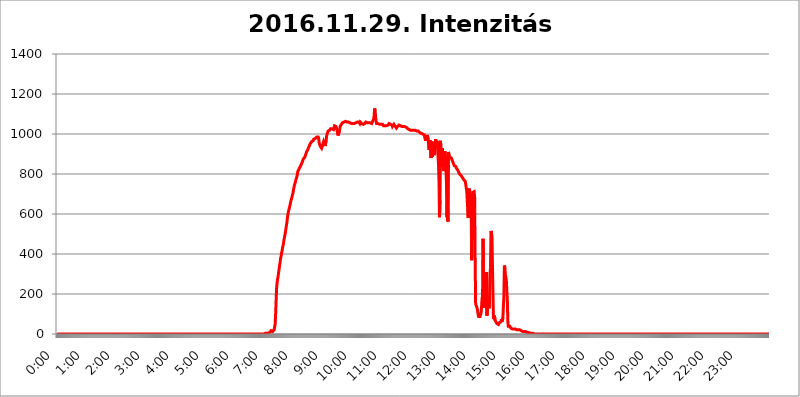
| Category | 2016.11.29. Intenzitás [W/m^2] |
|---|---|
| 0.0 | 0 |
| 0.0006944444444444445 | 0 |
| 0.001388888888888889 | 0 |
| 0.0020833333333333333 | 0 |
| 0.002777777777777778 | 0 |
| 0.003472222222222222 | 0 |
| 0.004166666666666667 | 0 |
| 0.004861111111111111 | 0 |
| 0.005555555555555556 | 0 |
| 0.0062499999999999995 | 0 |
| 0.006944444444444444 | 0 |
| 0.007638888888888889 | 0 |
| 0.008333333333333333 | 0 |
| 0.009027777777777779 | 0 |
| 0.009722222222222222 | 0 |
| 0.010416666666666666 | 0 |
| 0.011111111111111112 | 0 |
| 0.011805555555555555 | 0 |
| 0.012499999999999999 | 0 |
| 0.013194444444444444 | 0 |
| 0.013888888888888888 | 0 |
| 0.014583333333333332 | 0 |
| 0.015277777777777777 | 0 |
| 0.015972222222222224 | 0 |
| 0.016666666666666666 | 0 |
| 0.017361111111111112 | 0 |
| 0.018055555555555557 | 0 |
| 0.01875 | 0 |
| 0.019444444444444445 | 0 |
| 0.02013888888888889 | 0 |
| 0.020833333333333332 | 0 |
| 0.02152777777777778 | 0 |
| 0.022222222222222223 | 0 |
| 0.02291666666666667 | 0 |
| 0.02361111111111111 | 0 |
| 0.024305555555555556 | 0 |
| 0.024999999999999998 | 0 |
| 0.025694444444444447 | 0 |
| 0.02638888888888889 | 0 |
| 0.027083333333333334 | 0 |
| 0.027777777777777776 | 0 |
| 0.02847222222222222 | 0 |
| 0.029166666666666664 | 0 |
| 0.029861111111111113 | 0 |
| 0.030555555555555555 | 0 |
| 0.03125 | 0 |
| 0.03194444444444445 | 0 |
| 0.03263888888888889 | 0 |
| 0.03333333333333333 | 0 |
| 0.034027777777777775 | 0 |
| 0.034722222222222224 | 0 |
| 0.035416666666666666 | 0 |
| 0.036111111111111115 | 0 |
| 0.03680555555555556 | 0 |
| 0.0375 | 0 |
| 0.03819444444444444 | 0 |
| 0.03888888888888889 | 0 |
| 0.03958333333333333 | 0 |
| 0.04027777777777778 | 0 |
| 0.04097222222222222 | 0 |
| 0.041666666666666664 | 0 |
| 0.042361111111111106 | 0 |
| 0.04305555555555556 | 0 |
| 0.043750000000000004 | 0 |
| 0.044444444444444446 | 0 |
| 0.04513888888888889 | 0 |
| 0.04583333333333334 | 0 |
| 0.04652777777777778 | 0 |
| 0.04722222222222222 | 0 |
| 0.04791666666666666 | 0 |
| 0.04861111111111111 | 0 |
| 0.049305555555555554 | 0 |
| 0.049999999999999996 | 0 |
| 0.05069444444444445 | 0 |
| 0.051388888888888894 | 0 |
| 0.052083333333333336 | 0 |
| 0.05277777777777778 | 0 |
| 0.05347222222222222 | 0 |
| 0.05416666666666667 | 0 |
| 0.05486111111111111 | 0 |
| 0.05555555555555555 | 0 |
| 0.05625 | 0 |
| 0.05694444444444444 | 0 |
| 0.057638888888888885 | 0 |
| 0.05833333333333333 | 0 |
| 0.05902777777777778 | 0 |
| 0.059722222222222225 | 0 |
| 0.06041666666666667 | 0 |
| 0.061111111111111116 | 0 |
| 0.06180555555555556 | 0 |
| 0.0625 | 0 |
| 0.06319444444444444 | 0 |
| 0.06388888888888888 | 0 |
| 0.06458333333333334 | 0 |
| 0.06527777777777778 | 0 |
| 0.06597222222222222 | 0 |
| 0.06666666666666667 | 0 |
| 0.06736111111111111 | 0 |
| 0.06805555555555555 | 0 |
| 0.06874999999999999 | 0 |
| 0.06944444444444443 | 0 |
| 0.07013888888888889 | 0 |
| 0.07083333333333333 | 0 |
| 0.07152777777777779 | 0 |
| 0.07222222222222223 | 0 |
| 0.07291666666666667 | 0 |
| 0.07361111111111111 | 0 |
| 0.07430555555555556 | 0 |
| 0.075 | 0 |
| 0.07569444444444444 | 0 |
| 0.0763888888888889 | 0 |
| 0.07708333333333334 | 0 |
| 0.07777777777777778 | 0 |
| 0.07847222222222222 | 0 |
| 0.07916666666666666 | 0 |
| 0.0798611111111111 | 0 |
| 0.08055555555555556 | 0 |
| 0.08125 | 0 |
| 0.08194444444444444 | 0 |
| 0.08263888888888889 | 0 |
| 0.08333333333333333 | 0 |
| 0.08402777777777777 | 0 |
| 0.08472222222222221 | 0 |
| 0.08541666666666665 | 0 |
| 0.08611111111111112 | 0 |
| 0.08680555555555557 | 0 |
| 0.08750000000000001 | 0 |
| 0.08819444444444445 | 0 |
| 0.08888888888888889 | 0 |
| 0.08958333333333333 | 0 |
| 0.09027777777777778 | 0 |
| 0.09097222222222222 | 0 |
| 0.09166666666666667 | 0 |
| 0.09236111111111112 | 0 |
| 0.09305555555555556 | 0 |
| 0.09375 | 0 |
| 0.09444444444444444 | 0 |
| 0.09513888888888888 | 0 |
| 0.09583333333333333 | 0 |
| 0.09652777777777777 | 0 |
| 0.09722222222222222 | 0 |
| 0.09791666666666667 | 0 |
| 0.09861111111111111 | 0 |
| 0.09930555555555555 | 0 |
| 0.09999999999999999 | 0 |
| 0.10069444444444443 | 0 |
| 0.1013888888888889 | 0 |
| 0.10208333333333335 | 0 |
| 0.10277777777777779 | 0 |
| 0.10347222222222223 | 0 |
| 0.10416666666666667 | 0 |
| 0.10486111111111111 | 0 |
| 0.10555555555555556 | 0 |
| 0.10625 | 0 |
| 0.10694444444444444 | 0 |
| 0.1076388888888889 | 0 |
| 0.10833333333333334 | 0 |
| 0.10902777777777778 | 0 |
| 0.10972222222222222 | 0 |
| 0.1111111111111111 | 0 |
| 0.11180555555555556 | 0 |
| 0.11180555555555556 | 0 |
| 0.1125 | 0 |
| 0.11319444444444444 | 0 |
| 0.11388888888888889 | 0 |
| 0.11458333333333333 | 0 |
| 0.11527777777777777 | 0 |
| 0.11597222222222221 | 0 |
| 0.11666666666666665 | 0 |
| 0.1173611111111111 | 0 |
| 0.11805555555555557 | 0 |
| 0.11944444444444445 | 0 |
| 0.12013888888888889 | 0 |
| 0.12083333333333333 | 0 |
| 0.12152777777777778 | 0 |
| 0.12222222222222223 | 0 |
| 0.12291666666666667 | 0 |
| 0.12291666666666667 | 0 |
| 0.12361111111111112 | 0 |
| 0.12430555555555556 | 0 |
| 0.125 | 0 |
| 0.12569444444444444 | 0 |
| 0.12638888888888888 | 0 |
| 0.12708333333333333 | 0 |
| 0.16875 | 0 |
| 0.12847222222222224 | 0 |
| 0.12916666666666668 | 0 |
| 0.12986111111111112 | 0 |
| 0.13055555555555556 | 0 |
| 0.13125 | 0 |
| 0.13194444444444445 | 0 |
| 0.1326388888888889 | 0 |
| 0.13333333333333333 | 0 |
| 0.13402777777777777 | 0 |
| 0.13402777777777777 | 0 |
| 0.13472222222222222 | 0 |
| 0.13541666666666666 | 0 |
| 0.1361111111111111 | 0 |
| 0.13749999999999998 | 0 |
| 0.13819444444444443 | 0 |
| 0.1388888888888889 | 0 |
| 0.13958333333333334 | 0 |
| 0.14027777777777778 | 0 |
| 0.14097222222222222 | 0 |
| 0.14166666666666666 | 0 |
| 0.1423611111111111 | 0 |
| 0.14305555555555557 | 0 |
| 0.14375000000000002 | 0 |
| 0.14444444444444446 | 0 |
| 0.1451388888888889 | 0 |
| 0.1451388888888889 | 0 |
| 0.14652777777777778 | 0 |
| 0.14722222222222223 | 0 |
| 0.14791666666666667 | 0 |
| 0.1486111111111111 | 0 |
| 0.14930555555555555 | 0 |
| 0.15 | 0 |
| 0.15069444444444444 | 0 |
| 0.15138888888888888 | 0 |
| 0.15208333333333332 | 0 |
| 0.15277777777777776 | 0 |
| 0.15347222222222223 | 0 |
| 0.15416666666666667 | 0 |
| 0.15486111111111112 | 0 |
| 0.15555555555555556 | 0 |
| 0.15625 | 0 |
| 0.15694444444444444 | 0 |
| 0.15763888888888888 | 0 |
| 0.15833333333333333 | 0 |
| 0.15902777777777777 | 0 |
| 0.15972222222222224 | 0 |
| 0.16041666666666668 | 0 |
| 0.16111111111111112 | 0 |
| 0.16180555555555556 | 0 |
| 0.1625 | 0 |
| 0.16319444444444445 | 0 |
| 0.1638888888888889 | 0 |
| 0.16458333333333333 | 0 |
| 0.16527777777777777 | 0 |
| 0.16597222222222222 | 0 |
| 0.16666666666666666 | 0 |
| 0.1673611111111111 | 0 |
| 0.16805555555555554 | 0 |
| 0.16874999999999998 | 0 |
| 0.16944444444444443 | 0 |
| 0.17013888888888887 | 0 |
| 0.1708333333333333 | 0 |
| 0.17152777777777775 | 0 |
| 0.17222222222222225 | 0 |
| 0.1729166666666667 | 0 |
| 0.17361111111111113 | 0 |
| 0.17430555555555557 | 0 |
| 0.17500000000000002 | 0 |
| 0.17569444444444446 | 0 |
| 0.1763888888888889 | 0 |
| 0.17708333333333334 | 0 |
| 0.17777777777777778 | 0 |
| 0.17847222222222223 | 0 |
| 0.17916666666666667 | 0 |
| 0.1798611111111111 | 0 |
| 0.18055555555555555 | 0 |
| 0.18125 | 0 |
| 0.18194444444444444 | 0 |
| 0.1826388888888889 | 0 |
| 0.18333333333333335 | 0 |
| 0.1840277777777778 | 0 |
| 0.18472222222222223 | 0 |
| 0.18541666666666667 | 0 |
| 0.18611111111111112 | 0 |
| 0.18680555555555556 | 0 |
| 0.1875 | 0 |
| 0.18819444444444444 | 0 |
| 0.18888888888888888 | 0 |
| 0.18958333333333333 | 0 |
| 0.19027777777777777 | 0 |
| 0.1909722222222222 | 0 |
| 0.19166666666666665 | 0 |
| 0.19236111111111112 | 0 |
| 0.19305555555555554 | 0 |
| 0.19375 | 0 |
| 0.19444444444444445 | 0 |
| 0.1951388888888889 | 0 |
| 0.19583333333333333 | 0 |
| 0.19652777777777777 | 0 |
| 0.19722222222222222 | 0 |
| 0.19791666666666666 | 0 |
| 0.1986111111111111 | 0 |
| 0.19930555555555554 | 0 |
| 0.19999999999999998 | 0 |
| 0.20069444444444443 | 0 |
| 0.20138888888888887 | 0 |
| 0.2020833333333333 | 0 |
| 0.2027777777777778 | 0 |
| 0.2034722222222222 | 0 |
| 0.2041666666666667 | 0 |
| 0.20486111111111113 | 0 |
| 0.20555555555555557 | 0 |
| 0.20625000000000002 | 0 |
| 0.20694444444444446 | 0 |
| 0.2076388888888889 | 0 |
| 0.20833333333333334 | 0 |
| 0.20902777777777778 | 0 |
| 0.20972222222222223 | 0 |
| 0.21041666666666667 | 0 |
| 0.2111111111111111 | 0 |
| 0.21180555555555555 | 0 |
| 0.2125 | 0 |
| 0.21319444444444444 | 0 |
| 0.2138888888888889 | 0 |
| 0.21458333333333335 | 0 |
| 0.2152777777777778 | 0 |
| 0.21597222222222223 | 0 |
| 0.21666666666666667 | 0 |
| 0.21736111111111112 | 0 |
| 0.21805555555555556 | 0 |
| 0.21875 | 0 |
| 0.21944444444444444 | 0 |
| 0.22013888888888888 | 0 |
| 0.22083333333333333 | 0 |
| 0.22152777777777777 | 0 |
| 0.2222222222222222 | 0 |
| 0.22291666666666665 | 0 |
| 0.2236111111111111 | 0 |
| 0.22430555555555556 | 0 |
| 0.225 | 0 |
| 0.22569444444444445 | 0 |
| 0.2263888888888889 | 0 |
| 0.22708333333333333 | 0 |
| 0.22777777777777777 | 0 |
| 0.22847222222222222 | 0 |
| 0.22916666666666666 | 0 |
| 0.2298611111111111 | 0 |
| 0.23055555555555554 | 0 |
| 0.23124999999999998 | 0 |
| 0.23194444444444443 | 0 |
| 0.23263888888888887 | 0 |
| 0.2333333333333333 | 0 |
| 0.2340277777777778 | 0 |
| 0.2347222222222222 | 0 |
| 0.2354166666666667 | 0 |
| 0.23611111111111113 | 0 |
| 0.23680555555555557 | 0 |
| 0.23750000000000002 | 0 |
| 0.23819444444444446 | 0 |
| 0.2388888888888889 | 0 |
| 0.23958333333333334 | 0 |
| 0.24027777777777778 | 0 |
| 0.24097222222222223 | 0 |
| 0.24166666666666667 | 0 |
| 0.2423611111111111 | 0 |
| 0.24305555555555555 | 0 |
| 0.24375 | 0 |
| 0.24444444444444446 | 0 |
| 0.24513888888888888 | 0 |
| 0.24583333333333335 | 0 |
| 0.2465277777777778 | 0 |
| 0.24722222222222223 | 0 |
| 0.24791666666666667 | 0 |
| 0.24861111111111112 | 0 |
| 0.24930555555555556 | 0 |
| 0.25 | 0 |
| 0.25069444444444444 | 0 |
| 0.2513888888888889 | 0 |
| 0.2520833333333333 | 0 |
| 0.25277777777777777 | 0 |
| 0.2534722222222222 | 0 |
| 0.25416666666666665 | 0 |
| 0.2548611111111111 | 0 |
| 0.2555555555555556 | 0 |
| 0.25625000000000003 | 0 |
| 0.2569444444444445 | 0 |
| 0.2576388888888889 | 0 |
| 0.25833333333333336 | 0 |
| 0.2590277777777778 | 0 |
| 0.25972222222222224 | 0 |
| 0.2604166666666667 | 0 |
| 0.2611111111111111 | 0 |
| 0.26180555555555557 | 0 |
| 0.2625 | 0 |
| 0.26319444444444445 | 0 |
| 0.2638888888888889 | 0 |
| 0.26458333333333334 | 0 |
| 0.2652777777777778 | 0 |
| 0.2659722222222222 | 0 |
| 0.26666666666666666 | 0 |
| 0.2673611111111111 | 0 |
| 0.26805555555555555 | 0 |
| 0.26875 | 0 |
| 0.26944444444444443 | 0 |
| 0.2701388888888889 | 0 |
| 0.2708333333333333 | 0 |
| 0.27152777777777776 | 0 |
| 0.2722222222222222 | 0 |
| 0.27291666666666664 | 0 |
| 0.2736111111111111 | 0 |
| 0.2743055555555555 | 0 |
| 0.27499999999999997 | 0 |
| 0.27569444444444446 | 0 |
| 0.27638888888888885 | 0 |
| 0.27708333333333335 | 0 |
| 0.2777777777777778 | 0 |
| 0.27847222222222223 | 0 |
| 0.2791666666666667 | 0 |
| 0.2798611111111111 | 0 |
| 0.28055555555555556 | 0 |
| 0.28125 | 0 |
| 0.28194444444444444 | 0 |
| 0.2826388888888889 | 0 |
| 0.2833333333333333 | 0 |
| 0.28402777777777777 | 0 |
| 0.2847222222222222 | 0 |
| 0.28541666666666665 | 0 |
| 0.28611111111111115 | 0 |
| 0.28680555555555554 | 0 |
| 0.28750000000000003 | 0 |
| 0.2881944444444445 | 0 |
| 0.2888888888888889 | 0 |
| 0.28958333333333336 | 0 |
| 0.2902777777777778 | 0 |
| 0.29097222222222224 | 3.525 |
| 0.2916666666666667 | 3.525 |
| 0.2923611111111111 | 3.525 |
| 0.29305555555555557 | 3.525 |
| 0.29375 | 3.525 |
| 0.29444444444444445 | 3.525 |
| 0.2951388888888889 | 3.525 |
| 0.29583333333333334 | 3.525 |
| 0.2965277777777778 | 3.525 |
| 0.2972222222222222 | 7.887 |
| 0.29791666666666666 | 7.887 |
| 0.2986111111111111 | 12.257 |
| 0.29930555555555555 | 12.257 |
| 0.3 | 16.636 |
| 0.30069444444444443 | 16.636 |
| 0.3013888888888889 | 12.257 |
| 0.3020833333333333 | 12.257 |
| 0.30277777777777776 | 16.636 |
| 0.3034722222222222 | 16.636 |
| 0.30416666666666664 | 21.024 |
| 0.3048611111111111 | 25.419 |
| 0.3055555555555555 | 47.511 |
| 0.30624999999999997 | 96.682 |
| 0.3069444444444444 | 164.605 |
| 0.3076388888888889 | 228.436 |
| 0.30833333333333335 | 255.813 |
| 0.3090277777777778 | 274.047 |
| 0.30972222222222223 | 287.709 |
| 0.3104166666666667 | 305.898 |
| 0.3111111111111111 | 324.052 |
| 0.31180555555555556 | 342.162 |
| 0.3125 | 355.712 |
| 0.31319444444444444 | 378.224 |
| 0.3138888888888889 | 387.202 |
| 0.3145833333333333 | 405.108 |
| 0.31527777777777777 | 414.035 |
| 0.3159722222222222 | 431.833 |
| 0.31666666666666665 | 440.702 |
| 0.31736111111111115 | 453.968 |
| 0.31805555555555554 | 471.582 |
| 0.31875000000000003 | 484.735 |
| 0.3194444444444445 | 497.836 |
| 0.3201388888888889 | 510.885 |
| 0.32083333333333336 | 528.2 |
| 0.3215277777777778 | 545.416 |
| 0.32222222222222224 | 562.53 |
| 0.3229166666666667 | 583.779 |
| 0.3236111111111111 | 600.661 |
| 0.32430555555555557 | 613.252 |
| 0.325 | 621.613 |
| 0.32569444444444445 | 634.105 |
| 0.3263888888888889 | 642.4 |
| 0.32708333333333334 | 654.791 |
| 0.3277777777777778 | 667.123 |
| 0.3284722222222222 | 675.311 |
| 0.32916666666666666 | 683.473 |
| 0.3298611111111111 | 695.666 |
| 0.33055555555555555 | 703.762 |
| 0.33125 | 719.877 |
| 0.33194444444444443 | 731.896 |
| 0.3326388888888889 | 743.859 |
| 0.3333333333333333 | 751.803 |
| 0.3340277777777778 | 759.723 |
| 0.3347222222222222 | 771.559 |
| 0.3354166666666667 | 779.42 |
| 0.3361111111111111 | 787.258 |
| 0.3368055555555556 | 798.974 |
| 0.33749999999999997 | 814.519 |
| 0.33819444444444446 | 818.392 |
| 0.33888888888888885 | 822.26 |
| 0.33958333333333335 | 829.981 |
| 0.34027777777777773 | 833.834 |
| 0.34097222222222223 | 837.682 |
| 0.3416666666666666 | 841.526 |
| 0.3423611111111111 | 849.199 |
| 0.3430555555555555 | 853.029 |
| 0.34375 | 860.676 |
| 0.3444444444444445 | 868.305 |
| 0.3451388888888889 | 875.918 |
| 0.3458333333333334 | 879.719 |
| 0.34652777777777777 | 879.719 |
| 0.34722222222222227 | 883.516 |
| 0.34791666666666665 | 891.099 |
| 0.34861111111111115 | 894.885 |
| 0.34930555555555554 | 906.223 |
| 0.35000000000000003 | 913.766 |
| 0.3506944444444444 | 917.534 |
| 0.3513888888888889 | 921.298 |
| 0.3520833333333333 | 928.819 |
| 0.3527777777777778 | 932.576 |
| 0.3534722222222222 | 940.082 |
| 0.3541666666666667 | 947.58 |
| 0.3548611111111111 | 947.58 |
| 0.35555555555555557 | 955.071 |
| 0.35625 | 958.814 |
| 0.35694444444444445 | 962.555 |
| 0.3576388888888889 | 966.295 |
| 0.35833333333333334 | 966.295 |
| 0.3590277777777778 | 966.295 |
| 0.3597222222222222 | 973.772 |
| 0.36041666666666666 | 973.772 |
| 0.3611111111111111 | 977.508 |
| 0.36180555555555555 | 977.508 |
| 0.3625 | 977.508 |
| 0.36319444444444443 | 981.244 |
| 0.3638888888888889 | 984.98 |
| 0.3645833333333333 | 984.98 |
| 0.3652777777777778 | 984.98 |
| 0.3659722222222222 | 984.98 |
| 0.3666666666666667 | 977.508 |
| 0.3673611111111111 | 955.071 |
| 0.3680555555555556 | 947.58 |
| 0.36874999999999997 | 940.082 |
| 0.36944444444444446 | 936.33 |
| 0.37013888888888885 | 940.082 |
| 0.37083333333333335 | 928.819 |
| 0.37152777777777773 | 936.33 |
| 0.37222222222222223 | 940.082 |
| 0.3729166666666666 | 955.071 |
| 0.3736111111111111 | 962.555 |
| 0.3743055555555555 | 966.295 |
| 0.375 | 947.58 |
| 0.3756944444444445 | 940.082 |
| 0.3763888888888889 | 940.082 |
| 0.3770833333333334 | 966.295 |
| 0.37777777777777777 | 988.714 |
| 0.37847222222222227 | 999.916 |
| 0.37916666666666665 | 1007.383 |
| 0.37986111111111115 | 1014.852 |
| 0.38055555555555554 | 1018.587 |
| 0.38125000000000003 | 1018.587 |
| 0.3819444444444444 | 1018.587 |
| 0.3826388888888889 | 1022.323 |
| 0.3833333333333333 | 1026.06 |
| 0.3840277777777778 | 1022.323 |
| 0.3847222222222222 | 1026.06 |
| 0.3854166666666667 | 1026.06 |
| 0.3861111111111111 | 1029.798 |
| 0.38680555555555557 | 1026.06 |
| 0.3875 | 1022.323 |
| 0.38819444444444445 | 1029.798 |
| 0.3888888888888889 | 1041.019 |
| 0.38958333333333334 | 1041.019 |
| 0.3902777777777778 | 1041.019 |
| 0.3909722222222222 | 1037.277 |
| 0.39166666666666666 | 1029.798 |
| 0.3923611111111111 | 1026.06 |
| 0.39305555555555555 | 1007.383 |
| 0.39375 | 992.448 |
| 0.39444444444444443 | 988.714 |
| 0.3951388888888889 | 996.182 |
| 0.3958333333333333 | 1014.852 |
| 0.3965277777777778 | 1033.537 |
| 0.3972222222222222 | 1041.019 |
| 0.3979166666666667 | 1044.762 |
| 0.3986111111111111 | 1048.508 |
| 0.3993055555555556 | 1052.255 |
| 0.39999999999999997 | 1056.004 |
| 0.40069444444444446 | 1056.004 |
| 0.40138888888888885 | 1059.756 |
| 0.40208333333333335 | 1059.756 |
| 0.40277777777777773 | 1059.756 |
| 0.40347222222222223 | 1059.756 |
| 0.4041666666666666 | 1063.51 |
| 0.4048611111111111 | 1063.51 |
| 0.4055555555555555 | 1063.51 |
| 0.40625 | 1059.756 |
| 0.4069444444444445 | 1059.756 |
| 0.4076388888888889 | 1063.51 |
| 0.4083333333333334 | 1059.756 |
| 0.40902777777777777 | 1059.756 |
| 0.40972222222222227 | 1056.004 |
| 0.41041666666666665 | 1056.004 |
| 0.41111111111111115 | 1052.255 |
| 0.41180555555555554 | 1052.255 |
| 0.41250000000000003 | 1052.255 |
| 0.4131944444444444 | 1052.255 |
| 0.4138888888888889 | 1052.255 |
| 0.4145833333333333 | 1052.255 |
| 0.4152777777777778 | 1052.255 |
| 0.4159722222222222 | 1052.255 |
| 0.4166666666666667 | 1052.255 |
| 0.4173611111111111 | 1052.255 |
| 0.41805555555555557 | 1052.255 |
| 0.41875 | 1056.004 |
| 0.41944444444444445 | 1056.004 |
| 0.4201388888888889 | 1056.004 |
| 0.42083333333333334 | 1059.756 |
| 0.4215277777777778 | 1056.004 |
| 0.4222222222222222 | 1056.004 |
| 0.42291666666666666 | 1059.756 |
| 0.4236111111111111 | 1056.004 |
| 0.42430555555555555 | 1052.255 |
| 0.425 | 1059.756 |
| 0.42569444444444443 | 1056.004 |
| 0.4263888888888889 | 1056.004 |
| 0.4270833333333333 | 1052.255 |
| 0.4277777777777778 | 1052.255 |
| 0.4284722222222222 | 1052.255 |
| 0.4291666666666667 | 1048.508 |
| 0.4298611111111111 | 1052.255 |
| 0.4305555555555556 | 1052.255 |
| 0.43124999999999997 | 1052.255 |
| 0.43194444444444446 | 1052.255 |
| 0.43263888888888885 | 1059.756 |
| 0.43333333333333335 | 1059.756 |
| 0.43402777777777773 | 1059.756 |
| 0.43472222222222223 | 1056.004 |
| 0.4354166666666666 | 1056.004 |
| 0.4361111111111111 | 1056.004 |
| 0.4368055555555555 | 1056.004 |
| 0.4375 | 1056.004 |
| 0.4381944444444445 | 1052.255 |
| 0.4388888888888889 | 1056.004 |
| 0.4395833333333334 | 1056.004 |
| 0.44027777777777777 | 1052.255 |
| 0.44097222222222227 | 1052.255 |
| 0.44166666666666665 | 1056.004 |
| 0.44236111111111115 | 1063.51 |
| 0.44305555555555554 | 1067.267 |
| 0.44375000000000003 | 1074.789 |
| 0.4444444444444444 | 1089.873 |
| 0.4451388888888889 | 1127.879 |
| 0.4458333333333333 | 1116.426 |
| 0.4465277777777778 | 1082.324 |
| 0.4472222222222222 | 1063.51 |
| 0.4479166666666667 | 1052.255 |
| 0.4486111111111111 | 1048.508 |
| 0.44930555555555557 | 1052.255 |
| 0.45 | 1052.255 |
| 0.45069444444444445 | 1052.255 |
| 0.4513888888888889 | 1048.508 |
| 0.45208333333333334 | 1048.508 |
| 0.4527777777777778 | 1048.508 |
| 0.4534722222222222 | 1048.508 |
| 0.45416666666666666 | 1048.508 |
| 0.4548611111111111 | 1048.508 |
| 0.45555555555555555 | 1044.762 |
| 0.45625 | 1048.508 |
| 0.45694444444444443 | 1044.762 |
| 0.4576388888888889 | 1041.019 |
| 0.4583333333333333 | 1041.019 |
| 0.4590277777777778 | 1041.019 |
| 0.4597222222222222 | 1041.019 |
| 0.4604166666666667 | 1044.762 |
| 0.4611111111111111 | 1044.762 |
| 0.4618055555555556 | 1041.019 |
| 0.46249999999999997 | 1041.019 |
| 0.46319444444444446 | 1041.019 |
| 0.46388888888888885 | 1044.762 |
| 0.46458333333333335 | 1048.508 |
| 0.46527777777777773 | 1052.255 |
| 0.46597222222222223 | 1052.255 |
| 0.4666666666666666 | 1052.255 |
| 0.4673611111111111 | 1048.508 |
| 0.4680555555555555 | 1044.762 |
| 0.46875 | 1044.762 |
| 0.4694444444444445 | 1044.762 |
| 0.4701388888888889 | 1037.277 |
| 0.4708333333333334 | 1037.277 |
| 0.47152777777777777 | 1041.019 |
| 0.47222222222222227 | 1048.508 |
| 0.47291666666666665 | 1044.762 |
| 0.47361111111111115 | 1041.019 |
| 0.47430555555555554 | 1041.019 |
| 0.47500000000000003 | 1037.277 |
| 0.4756944444444444 | 1029.798 |
| 0.4763888888888889 | 1029.798 |
| 0.4770833333333333 | 1037.277 |
| 0.4777777777777778 | 1041.019 |
| 0.4784722222222222 | 1041.019 |
| 0.4791666666666667 | 1044.762 |
| 0.4798611111111111 | 1041.019 |
| 0.48055555555555557 | 1041.019 |
| 0.48125 | 1041.019 |
| 0.48194444444444445 | 1041.019 |
| 0.4826388888888889 | 1041.019 |
| 0.48333333333333334 | 1037.277 |
| 0.4840277777777778 | 1037.277 |
| 0.4847222222222222 | 1037.277 |
| 0.48541666666666666 | 1037.277 |
| 0.4861111111111111 | 1037.277 |
| 0.48680555555555555 | 1037.277 |
| 0.4875 | 1037.277 |
| 0.48819444444444443 | 1033.537 |
| 0.4888888888888889 | 1037.277 |
| 0.4895833333333333 | 1033.537 |
| 0.4902777777777778 | 1029.798 |
| 0.4909722222222222 | 1029.798 |
| 0.4916666666666667 | 1026.06 |
| 0.4923611111111111 | 1022.323 |
| 0.4930555555555556 | 1022.323 |
| 0.49374999999999997 | 1022.323 |
| 0.49444444444444446 | 1022.323 |
| 0.49513888888888885 | 1018.587 |
| 0.49583333333333335 | 1018.587 |
| 0.49652777777777773 | 1018.587 |
| 0.49722222222222223 | 1018.587 |
| 0.4979166666666666 | 1018.587 |
| 0.4986111111111111 | 1018.587 |
| 0.4993055555555555 | 1014.852 |
| 0.5 | 1018.587 |
| 0.5006944444444444 | 1018.587 |
| 0.5013888888888889 | 1018.587 |
| 0.5020833333333333 | 1018.587 |
| 0.5027777777777778 | 1014.852 |
| 0.5034722222222222 | 1014.852 |
| 0.5041666666666667 | 1014.852 |
| 0.5048611111111111 | 1014.852 |
| 0.5055555555555555 | 1014.852 |
| 0.50625 | 1014.852 |
| 0.5069444444444444 | 1011.118 |
| 0.5076388888888889 | 1011.118 |
| 0.5083333333333333 | 1007.383 |
| 0.5090277777777777 | 1007.383 |
| 0.5097222222222222 | 1003.65 |
| 0.5104166666666666 | 1003.65 |
| 0.5111111111111112 | 999.916 |
| 0.5118055555555555 | 999.916 |
| 0.5125000000000001 | 999.916 |
| 0.5131944444444444 | 999.916 |
| 0.513888888888889 | 999.916 |
| 0.5145833333333333 | 996.182 |
| 0.5152777777777778 | 996.182 |
| 0.5159722222222222 | 992.448 |
| 0.5166666666666667 | 966.295 |
| 0.517361111111111 | 988.714 |
| 0.5180555555555556 | 992.448 |
| 0.5187499999999999 | 992.448 |
| 0.5194444444444445 | 988.714 |
| 0.5201388888888888 | 981.244 |
| 0.5208333333333334 | 947.58 |
| 0.5215277777777778 | 921.298 |
| 0.5222222222222223 | 962.555 |
| 0.5229166666666667 | 970.034 |
| 0.5236111111111111 | 970.034 |
| 0.5243055555555556 | 879.719 |
| 0.525 | 917.534 |
| 0.5256944444444445 | 962.555 |
| 0.5263888888888889 | 887.309 |
| 0.5270833333333333 | 943.832 |
| 0.5277777777777778 | 932.576 |
| 0.5284722222222222 | 894.885 |
| 0.5291666666666667 | 902.447 |
| 0.5298611111111111 | 940.082 |
| 0.5305555555555556 | 973.772 |
| 0.53125 | 970.034 |
| 0.5319444444444444 | 947.58 |
| 0.5326388888888889 | 966.295 |
| 0.5333333333333333 | 936.33 |
| 0.5340277777777778 | 940.082 |
| 0.5347222222222222 | 849.199 |
| 0.5354166666666667 | 763.674 |
| 0.5361111111111111 | 583.779 |
| 0.5368055555555555 | 667.123 |
| 0.5375 | 966.295 |
| 0.5381944444444444 | 921.298 |
| 0.5388888888888889 | 837.682 |
| 0.5395833333333333 | 906.223 |
| 0.5402777777777777 | 928.819 |
| 0.5409722222222222 | 837.682 |
| 0.5416666666666666 | 814.519 |
| 0.5423611111111112 | 849.199 |
| 0.5430555555555555 | 906.223 |
| 0.5437500000000001 | 913.766 |
| 0.5444444444444444 | 883.516 |
| 0.545138888888889 | 841.526 |
| 0.5458333333333333 | 755.766 |
| 0.5465277777777778 | 583.779 |
| 0.5472222222222222 | 658.909 |
| 0.5479166666666667 | 562.53 |
| 0.548611111111111 | 909.996 |
| 0.5493055555555556 | 902.447 |
| 0.5499999999999999 | 891.099 |
| 0.5506944444444445 | 883.516 |
| 0.5513888888888888 | 887.309 |
| 0.5520833333333334 | 883.516 |
| 0.5527777777777778 | 879.719 |
| 0.5534722222222223 | 872.114 |
| 0.5541666666666667 | 868.305 |
| 0.5548611111111111 | 860.676 |
| 0.5555555555555556 | 853.029 |
| 0.55625 | 849.199 |
| 0.5569444444444445 | 841.526 |
| 0.5576388888888889 | 845.365 |
| 0.5583333333333333 | 841.526 |
| 0.5590277777777778 | 837.682 |
| 0.5597222222222222 | 829.981 |
| 0.5604166666666667 | 826.123 |
| 0.5611111111111111 | 822.26 |
| 0.5618055555555556 | 818.392 |
| 0.5625 | 814.519 |
| 0.5631944444444444 | 806.757 |
| 0.5638888888888889 | 802.868 |
| 0.5645833333333333 | 798.974 |
| 0.5652777777777778 | 795.074 |
| 0.5659722222222222 | 795.074 |
| 0.5666666666666667 | 791.169 |
| 0.5673611111111111 | 791.169 |
| 0.5680555555555555 | 783.342 |
| 0.56875 | 783.342 |
| 0.5694444444444444 | 779.42 |
| 0.5701388888888889 | 771.559 |
| 0.5708333333333333 | 771.559 |
| 0.5715277777777777 | 767.62 |
| 0.5722222222222222 | 763.674 |
| 0.5729166666666666 | 767.62 |
| 0.5736111111111112 | 767.62 |
| 0.5743055555555555 | 715.858 |
| 0.5750000000000001 | 671.22 |
| 0.5756944444444444 | 667.123 |
| 0.576388888888889 | 579.542 |
| 0.5770833333333333 | 727.896 |
| 0.5777777777777778 | 723.889 |
| 0.5784722222222222 | 715.858 |
| 0.5791666666666667 | 707.8 |
| 0.579861111111111 | 707.8 |
| 0.5805555555555556 | 634.105 |
| 0.5812499999999999 | 369.23 |
| 0.5819444444444445 | 621.613 |
| 0.5826388888888888 | 707.8 |
| 0.5833333333333334 | 707.8 |
| 0.5840277777777778 | 707.8 |
| 0.5847222222222223 | 711.832 |
| 0.5854166666666667 | 683.473 |
| 0.5861111111111111 | 369.23 |
| 0.5868055555555556 | 150.964 |
| 0.5875 | 150.964 |
| 0.5881944444444445 | 146.423 |
| 0.5888888888888889 | 128.284 |
| 0.5895833333333333 | 114.716 |
| 0.5902777777777778 | 96.682 |
| 0.5909722222222222 | 87.692 |
| 0.5916666666666667 | 83.205 |
| 0.5923611111111111 | 83.205 |
| 0.5930555555555556 | 87.692 |
| 0.59375 | 87.692 |
| 0.5944444444444444 | 105.69 |
| 0.5951388888888889 | 137.347 |
| 0.5958333333333333 | 178.264 |
| 0.5965277777777778 | 191.937 |
| 0.5972222222222222 | 475.972 |
| 0.5979166666666667 | 187.378 |
| 0.5986111111111111 | 150.964 |
| 0.5993055555555555 | 132.814 |
| 0.6 | 187.378 |
| 0.6006944444444444 | 169.156 |
| 0.6013888888888889 | 219.309 |
| 0.6020833333333333 | 310.44 |
| 0.6027777777777777 | 92.184 |
| 0.6034722222222222 | 187.378 |
| 0.6041666666666666 | 182.82 |
| 0.6048611111111112 | 173.709 |
| 0.6055555555555555 | 128.284 |
| 0.6062500000000001 | 164.605 |
| 0.6069444444444444 | 296.808 |
| 0.607638888888889 | 333.113 |
| 0.6083333333333333 | 515.223 |
| 0.6090277777777778 | 506.542 |
| 0.6097222222222222 | 489.108 |
| 0.6104166666666667 | 342.162 |
| 0.611111111111111 | 205.62 |
| 0.6118055555555556 | 74.246 |
| 0.6124999999999999 | 74.246 |
| 0.6131944444444445 | 92.184 |
| 0.6138888888888888 | 69.775 |
| 0.6145833333333334 | 65.31 |
| 0.6152777777777778 | 60.85 |
| 0.6159722222222223 | 56.398 |
| 0.6166666666666667 | 51.951 |
| 0.6173611111111111 | 47.511 |
| 0.6180555555555556 | 47.511 |
| 0.61875 | 47.511 |
| 0.6194444444444445 | 51.951 |
| 0.6201388888888889 | 56.398 |
| 0.6208333333333333 | 56.398 |
| 0.6215277777777778 | 60.85 |
| 0.6222222222222222 | 60.85 |
| 0.6229166666666667 | 74.246 |
| 0.6236111111111111 | 60.85 |
| 0.6243055555555556 | 65.31 |
| 0.625 | 78.722 |
| 0.6256944444444444 | 137.347 |
| 0.6263888888888889 | 182.82 |
| 0.6270833333333333 | 342.162 |
| 0.6277777777777778 | 333.113 |
| 0.6284722222222222 | 296.808 |
| 0.6291666666666667 | 283.156 |
| 0.6298611111111111 | 269.49 |
| 0.6305555555555555 | 214.746 |
| 0.63125 | 173.709 |
| 0.6319444444444444 | 65.31 |
| 0.6326388888888889 | 38.653 |
| 0.6333333333333333 | 38.653 |
| 0.6340277777777777 | 38.653 |
| 0.6347222222222222 | 38.653 |
| 0.6354166666666666 | 34.234 |
| 0.6361111111111112 | 29.823 |
| 0.6368055555555555 | 29.823 |
| 0.6375000000000001 | 29.823 |
| 0.6381944444444444 | 25.419 |
| 0.638888888888889 | 25.419 |
| 0.6395833333333333 | 25.419 |
| 0.6402777777777778 | 25.419 |
| 0.6409722222222222 | 25.419 |
| 0.6416666666666667 | 25.419 |
| 0.642361111111111 | 25.419 |
| 0.6430555555555556 | 25.419 |
| 0.6437499999999999 | 25.419 |
| 0.6444444444444445 | 21.024 |
| 0.6451388888888888 | 21.024 |
| 0.6458333333333334 | 21.024 |
| 0.6465277777777778 | 21.024 |
| 0.6472222222222223 | 21.024 |
| 0.6479166666666667 | 16.636 |
| 0.6486111111111111 | 21.024 |
| 0.6493055555555556 | 21.024 |
| 0.65 | 16.636 |
| 0.6506944444444445 | 16.636 |
| 0.6513888888888889 | 16.636 |
| 0.6520833333333333 | 12.257 |
| 0.6527777777777778 | 12.257 |
| 0.6534722222222222 | 12.257 |
| 0.6541666666666667 | 12.257 |
| 0.6548611111111111 | 12.257 |
| 0.6555555555555556 | 12.257 |
| 0.65625 | 12.257 |
| 0.6569444444444444 | 12.257 |
| 0.6576388888888889 | 7.887 |
| 0.6583333333333333 | 7.887 |
| 0.6590277777777778 | 7.887 |
| 0.6597222222222222 | 7.887 |
| 0.6604166666666667 | 7.887 |
| 0.6611111111111111 | 7.887 |
| 0.6618055555555555 | 7.887 |
| 0.6625 | 3.525 |
| 0.6631944444444444 | 3.525 |
| 0.6638888888888889 | 3.525 |
| 0.6645833333333333 | 3.525 |
| 0.6652777777777777 | 3.525 |
| 0.6659722222222222 | 3.525 |
| 0.6666666666666666 | 3.525 |
| 0.6673611111111111 | 3.525 |
| 0.6680555555555556 | 3.525 |
| 0.6687500000000001 | 0 |
| 0.6694444444444444 | 0 |
| 0.6701388888888888 | 0 |
| 0.6708333333333334 | 0 |
| 0.6715277777777778 | 0 |
| 0.6722222222222222 | 0 |
| 0.6729166666666666 | 0 |
| 0.6736111111111112 | 0 |
| 0.6743055555555556 | 0 |
| 0.6749999999999999 | 0 |
| 0.6756944444444444 | 0 |
| 0.6763888888888889 | 0 |
| 0.6770833333333334 | 0 |
| 0.6777777777777777 | 0 |
| 0.6784722222222223 | 0 |
| 0.6791666666666667 | 0 |
| 0.6798611111111111 | 0 |
| 0.6805555555555555 | 0 |
| 0.68125 | 0 |
| 0.6819444444444445 | 0 |
| 0.6826388888888889 | 0 |
| 0.6833333333333332 | 0 |
| 0.6840277777777778 | 0 |
| 0.6847222222222222 | 0 |
| 0.6854166666666667 | 0 |
| 0.686111111111111 | 0 |
| 0.6868055555555556 | 0 |
| 0.6875 | 0 |
| 0.6881944444444444 | 0 |
| 0.688888888888889 | 0 |
| 0.6895833333333333 | 0 |
| 0.6902777777777778 | 0 |
| 0.6909722222222222 | 0 |
| 0.6916666666666668 | 0 |
| 0.6923611111111111 | 0 |
| 0.6930555555555555 | 0 |
| 0.69375 | 0 |
| 0.6944444444444445 | 0 |
| 0.6951388888888889 | 0 |
| 0.6958333333333333 | 0 |
| 0.6965277777777777 | 0 |
| 0.6972222222222223 | 0 |
| 0.6979166666666666 | 0 |
| 0.6986111111111111 | 0 |
| 0.6993055555555556 | 0 |
| 0.7000000000000001 | 0 |
| 0.7006944444444444 | 0 |
| 0.7013888888888888 | 0 |
| 0.7020833333333334 | 0 |
| 0.7027777777777778 | 0 |
| 0.7034722222222222 | 0 |
| 0.7041666666666666 | 0 |
| 0.7048611111111112 | 0 |
| 0.7055555555555556 | 0 |
| 0.7062499999999999 | 0 |
| 0.7069444444444444 | 0 |
| 0.7076388888888889 | 0 |
| 0.7083333333333334 | 0 |
| 0.7090277777777777 | 0 |
| 0.7097222222222223 | 0 |
| 0.7104166666666667 | 0 |
| 0.7111111111111111 | 0 |
| 0.7118055555555555 | 0 |
| 0.7125 | 0 |
| 0.7131944444444445 | 0 |
| 0.7138888888888889 | 0 |
| 0.7145833333333332 | 0 |
| 0.7152777777777778 | 0 |
| 0.7159722222222222 | 0 |
| 0.7166666666666667 | 0 |
| 0.717361111111111 | 0 |
| 0.7180555555555556 | 0 |
| 0.71875 | 0 |
| 0.7194444444444444 | 0 |
| 0.720138888888889 | 0 |
| 0.7208333333333333 | 0 |
| 0.7215277777777778 | 0 |
| 0.7222222222222222 | 0 |
| 0.7229166666666668 | 0 |
| 0.7236111111111111 | 0 |
| 0.7243055555555555 | 0 |
| 0.725 | 0 |
| 0.7256944444444445 | 0 |
| 0.7263888888888889 | 0 |
| 0.7270833333333333 | 0 |
| 0.7277777777777777 | 0 |
| 0.7284722222222223 | 0 |
| 0.7291666666666666 | 0 |
| 0.7298611111111111 | 0 |
| 0.7305555555555556 | 0 |
| 0.7312500000000001 | 0 |
| 0.7319444444444444 | 0 |
| 0.7326388888888888 | 0 |
| 0.7333333333333334 | 0 |
| 0.7340277777777778 | 0 |
| 0.7347222222222222 | 0 |
| 0.7354166666666666 | 0 |
| 0.7361111111111112 | 0 |
| 0.7368055555555556 | 0 |
| 0.7374999999999999 | 0 |
| 0.7381944444444444 | 0 |
| 0.7388888888888889 | 0 |
| 0.7395833333333334 | 0 |
| 0.7402777777777777 | 0 |
| 0.7409722222222223 | 0 |
| 0.7416666666666667 | 0 |
| 0.7423611111111111 | 0 |
| 0.7430555555555555 | 0 |
| 0.74375 | 0 |
| 0.7444444444444445 | 0 |
| 0.7451388888888889 | 0 |
| 0.7458333333333332 | 0 |
| 0.7465277777777778 | 0 |
| 0.7472222222222222 | 0 |
| 0.7479166666666667 | 0 |
| 0.748611111111111 | 0 |
| 0.7493055555555556 | 0 |
| 0.75 | 0 |
| 0.7506944444444444 | 0 |
| 0.751388888888889 | 0 |
| 0.7520833333333333 | 0 |
| 0.7527777777777778 | 0 |
| 0.7534722222222222 | 0 |
| 0.7541666666666668 | 0 |
| 0.7548611111111111 | 0 |
| 0.7555555555555555 | 0 |
| 0.75625 | 0 |
| 0.7569444444444445 | 0 |
| 0.7576388888888889 | 0 |
| 0.7583333333333333 | 0 |
| 0.7590277777777777 | 0 |
| 0.7597222222222223 | 0 |
| 0.7604166666666666 | 0 |
| 0.7611111111111111 | 0 |
| 0.7618055555555556 | 0 |
| 0.7625000000000001 | 0 |
| 0.7631944444444444 | 0 |
| 0.7638888888888888 | 0 |
| 0.7645833333333334 | 0 |
| 0.7652777777777778 | 0 |
| 0.7659722222222222 | 0 |
| 0.7666666666666666 | 0 |
| 0.7673611111111112 | 0 |
| 0.7680555555555556 | 0 |
| 0.7687499999999999 | 0 |
| 0.7694444444444444 | 0 |
| 0.7701388888888889 | 0 |
| 0.7708333333333334 | 0 |
| 0.7715277777777777 | 0 |
| 0.7722222222222223 | 0 |
| 0.7729166666666667 | 0 |
| 0.7736111111111111 | 0 |
| 0.7743055555555555 | 0 |
| 0.775 | 0 |
| 0.7756944444444445 | 0 |
| 0.7763888888888889 | 0 |
| 0.7770833333333332 | 0 |
| 0.7777777777777778 | 0 |
| 0.7784722222222222 | 0 |
| 0.7791666666666667 | 0 |
| 0.779861111111111 | 0 |
| 0.7805555555555556 | 0 |
| 0.78125 | 0 |
| 0.7819444444444444 | 0 |
| 0.782638888888889 | 0 |
| 0.7833333333333333 | 0 |
| 0.7840277777777778 | 0 |
| 0.7847222222222222 | 0 |
| 0.7854166666666668 | 0 |
| 0.7861111111111111 | 0 |
| 0.7868055555555555 | 0 |
| 0.7875 | 0 |
| 0.7881944444444445 | 0 |
| 0.7888888888888889 | 0 |
| 0.7895833333333333 | 0 |
| 0.7902777777777777 | 0 |
| 0.7909722222222223 | 0 |
| 0.7916666666666666 | 0 |
| 0.7923611111111111 | 0 |
| 0.7930555555555556 | 0 |
| 0.7937500000000001 | 0 |
| 0.7944444444444444 | 0 |
| 0.7951388888888888 | 0 |
| 0.7958333333333334 | 0 |
| 0.7965277777777778 | 0 |
| 0.7972222222222222 | 0 |
| 0.7979166666666666 | 0 |
| 0.7986111111111112 | 0 |
| 0.7993055555555556 | 0 |
| 0.7999999999999999 | 0 |
| 0.8006944444444444 | 0 |
| 0.8013888888888889 | 0 |
| 0.8020833333333334 | 0 |
| 0.8027777777777777 | 0 |
| 0.8034722222222223 | 0 |
| 0.8041666666666667 | 0 |
| 0.8048611111111111 | 0 |
| 0.8055555555555555 | 0 |
| 0.80625 | 0 |
| 0.8069444444444445 | 0 |
| 0.8076388888888889 | 0 |
| 0.8083333333333332 | 0 |
| 0.8090277777777778 | 0 |
| 0.8097222222222222 | 0 |
| 0.8104166666666667 | 0 |
| 0.811111111111111 | 0 |
| 0.8118055555555556 | 0 |
| 0.8125 | 0 |
| 0.8131944444444444 | 0 |
| 0.813888888888889 | 0 |
| 0.8145833333333333 | 0 |
| 0.8152777777777778 | 0 |
| 0.8159722222222222 | 0 |
| 0.8166666666666668 | 0 |
| 0.8173611111111111 | 0 |
| 0.8180555555555555 | 0 |
| 0.81875 | 0 |
| 0.8194444444444445 | 0 |
| 0.8201388888888889 | 0 |
| 0.8208333333333333 | 0 |
| 0.8215277777777777 | 0 |
| 0.8222222222222223 | 0 |
| 0.8229166666666666 | 0 |
| 0.8236111111111111 | 0 |
| 0.8243055555555556 | 0 |
| 0.8250000000000001 | 0 |
| 0.8256944444444444 | 0 |
| 0.8263888888888888 | 0 |
| 0.8270833333333334 | 0 |
| 0.8277777777777778 | 0 |
| 0.8284722222222222 | 0 |
| 0.8291666666666666 | 0 |
| 0.8298611111111112 | 0 |
| 0.8305555555555556 | 0 |
| 0.8312499999999999 | 0 |
| 0.8319444444444444 | 0 |
| 0.8326388888888889 | 0 |
| 0.8333333333333334 | 0 |
| 0.8340277777777777 | 0 |
| 0.8347222222222223 | 0 |
| 0.8354166666666667 | 0 |
| 0.8361111111111111 | 0 |
| 0.8368055555555555 | 0 |
| 0.8375 | 0 |
| 0.8381944444444445 | 0 |
| 0.8388888888888889 | 0 |
| 0.8395833333333332 | 0 |
| 0.8402777777777778 | 0 |
| 0.8409722222222222 | 0 |
| 0.8416666666666667 | 0 |
| 0.842361111111111 | 0 |
| 0.8430555555555556 | 0 |
| 0.84375 | 0 |
| 0.8444444444444444 | 0 |
| 0.845138888888889 | 0 |
| 0.8458333333333333 | 0 |
| 0.8465277777777778 | 0 |
| 0.8472222222222222 | 0 |
| 0.8479166666666668 | 0 |
| 0.8486111111111111 | 0 |
| 0.8493055555555555 | 0 |
| 0.85 | 0 |
| 0.8506944444444445 | 0 |
| 0.8513888888888889 | 0 |
| 0.8520833333333333 | 0 |
| 0.8527777777777777 | 0 |
| 0.8534722222222223 | 0 |
| 0.8541666666666666 | 0 |
| 0.8548611111111111 | 0 |
| 0.8555555555555556 | 0 |
| 0.8562500000000001 | 0 |
| 0.8569444444444444 | 0 |
| 0.8576388888888888 | 0 |
| 0.8583333333333334 | 0 |
| 0.8590277777777778 | 0 |
| 0.8597222222222222 | 0 |
| 0.8604166666666666 | 0 |
| 0.8611111111111112 | 0 |
| 0.8618055555555556 | 0 |
| 0.8624999999999999 | 0 |
| 0.8631944444444444 | 0 |
| 0.8638888888888889 | 0 |
| 0.8645833333333334 | 0 |
| 0.8652777777777777 | 0 |
| 0.8659722222222223 | 0 |
| 0.8666666666666667 | 0 |
| 0.8673611111111111 | 0 |
| 0.8680555555555555 | 0 |
| 0.86875 | 0 |
| 0.8694444444444445 | 0 |
| 0.8701388888888889 | 0 |
| 0.8708333333333332 | 0 |
| 0.8715277777777778 | 0 |
| 0.8722222222222222 | 0 |
| 0.8729166666666667 | 0 |
| 0.873611111111111 | 0 |
| 0.8743055555555556 | 0 |
| 0.875 | 0 |
| 0.8756944444444444 | 0 |
| 0.876388888888889 | 0 |
| 0.8770833333333333 | 0 |
| 0.8777777777777778 | 0 |
| 0.8784722222222222 | 0 |
| 0.8791666666666668 | 0 |
| 0.8798611111111111 | 0 |
| 0.8805555555555555 | 0 |
| 0.88125 | 0 |
| 0.8819444444444445 | 0 |
| 0.8826388888888889 | 0 |
| 0.8833333333333333 | 0 |
| 0.8840277777777777 | 0 |
| 0.8847222222222223 | 0 |
| 0.8854166666666666 | 0 |
| 0.8861111111111111 | 0 |
| 0.8868055555555556 | 0 |
| 0.8875000000000001 | 0 |
| 0.8881944444444444 | 0 |
| 0.8888888888888888 | 0 |
| 0.8895833333333334 | 0 |
| 0.8902777777777778 | 0 |
| 0.8909722222222222 | 0 |
| 0.8916666666666666 | 0 |
| 0.8923611111111112 | 0 |
| 0.8930555555555556 | 0 |
| 0.8937499999999999 | 0 |
| 0.8944444444444444 | 0 |
| 0.8951388888888889 | 0 |
| 0.8958333333333334 | 0 |
| 0.8965277777777777 | 0 |
| 0.8972222222222223 | 0 |
| 0.8979166666666667 | 0 |
| 0.8986111111111111 | 0 |
| 0.8993055555555555 | 0 |
| 0.9 | 0 |
| 0.9006944444444445 | 0 |
| 0.9013888888888889 | 0 |
| 0.9020833333333332 | 0 |
| 0.9027777777777778 | 0 |
| 0.9034722222222222 | 0 |
| 0.9041666666666667 | 0 |
| 0.904861111111111 | 0 |
| 0.9055555555555556 | 0 |
| 0.90625 | 0 |
| 0.9069444444444444 | 0 |
| 0.907638888888889 | 0 |
| 0.9083333333333333 | 0 |
| 0.9090277777777778 | 0 |
| 0.9097222222222222 | 0 |
| 0.9104166666666668 | 0 |
| 0.9111111111111111 | 0 |
| 0.9118055555555555 | 0 |
| 0.9125 | 0 |
| 0.9131944444444445 | 0 |
| 0.9138888888888889 | 0 |
| 0.9145833333333333 | 0 |
| 0.9152777777777777 | 0 |
| 0.9159722222222223 | 0 |
| 0.9166666666666666 | 0 |
| 0.9173611111111111 | 0 |
| 0.9180555555555556 | 0 |
| 0.9187500000000001 | 0 |
| 0.9194444444444444 | 0 |
| 0.9201388888888888 | 0 |
| 0.9208333333333334 | 0 |
| 0.9215277777777778 | 0 |
| 0.9222222222222222 | 0 |
| 0.9229166666666666 | 0 |
| 0.9236111111111112 | 0 |
| 0.9243055555555556 | 0 |
| 0.9249999999999999 | 0 |
| 0.9256944444444444 | 0 |
| 0.9263888888888889 | 0 |
| 0.9270833333333334 | 0 |
| 0.9277777777777777 | 0 |
| 0.9284722222222223 | 0 |
| 0.9291666666666667 | 0 |
| 0.9298611111111111 | 0 |
| 0.9305555555555555 | 0 |
| 0.93125 | 0 |
| 0.9319444444444445 | 0 |
| 0.9326388888888889 | 0 |
| 0.9333333333333332 | 0 |
| 0.9340277777777778 | 0 |
| 0.9347222222222222 | 0 |
| 0.9354166666666667 | 0 |
| 0.936111111111111 | 0 |
| 0.9368055555555556 | 0 |
| 0.9375 | 0 |
| 0.9381944444444444 | 0 |
| 0.938888888888889 | 0 |
| 0.9395833333333333 | 0 |
| 0.9402777777777778 | 0 |
| 0.9409722222222222 | 0 |
| 0.9416666666666668 | 0 |
| 0.9423611111111111 | 0 |
| 0.9430555555555555 | 0 |
| 0.94375 | 0 |
| 0.9444444444444445 | 0 |
| 0.9451388888888889 | 0 |
| 0.9458333333333333 | 0 |
| 0.9465277777777777 | 0 |
| 0.9472222222222223 | 0 |
| 0.9479166666666666 | 0 |
| 0.9486111111111111 | 0 |
| 0.9493055555555556 | 0 |
| 0.9500000000000001 | 0 |
| 0.9506944444444444 | 0 |
| 0.9513888888888888 | 0 |
| 0.9520833333333334 | 0 |
| 0.9527777777777778 | 0 |
| 0.9534722222222222 | 0 |
| 0.9541666666666666 | 0 |
| 0.9548611111111112 | 0 |
| 0.9555555555555556 | 0 |
| 0.9562499999999999 | 0 |
| 0.9569444444444444 | 0 |
| 0.9576388888888889 | 0 |
| 0.9583333333333334 | 0 |
| 0.9590277777777777 | 0 |
| 0.9597222222222223 | 0 |
| 0.9604166666666667 | 0 |
| 0.9611111111111111 | 0 |
| 0.9618055555555555 | 0 |
| 0.9625 | 0 |
| 0.9631944444444445 | 0 |
| 0.9638888888888889 | 0 |
| 0.9645833333333332 | 0 |
| 0.9652777777777778 | 0 |
| 0.9659722222222222 | 0 |
| 0.9666666666666667 | 0 |
| 0.967361111111111 | 0 |
| 0.9680555555555556 | 0 |
| 0.96875 | 0 |
| 0.9694444444444444 | 0 |
| 0.970138888888889 | 0 |
| 0.9708333333333333 | 0 |
| 0.9715277777777778 | 0 |
| 0.9722222222222222 | 0 |
| 0.9729166666666668 | 0 |
| 0.9736111111111111 | 0 |
| 0.9743055555555555 | 0 |
| 0.975 | 0 |
| 0.9756944444444445 | 0 |
| 0.9763888888888889 | 0 |
| 0.9770833333333333 | 0 |
| 0.9777777777777777 | 0 |
| 0.9784722222222223 | 0 |
| 0.9791666666666666 | 0 |
| 0.9798611111111111 | 0 |
| 0.9805555555555556 | 0 |
| 0.9812500000000001 | 0 |
| 0.9819444444444444 | 0 |
| 0.9826388888888888 | 0 |
| 0.9833333333333334 | 0 |
| 0.9840277777777778 | 0 |
| 0.9847222222222222 | 0 |
| 0.9854166666666666 | 0 |
| 0.9861111111111112 | 0 |
| 0.9868055555555556 | 0 |
| 0.9874999999999999 | 0 |
| 0.9881944444444444 | 0 |
| 0.9888888888888889 | 0 |
| 0.9895833333333334 | 0 |
| 0.9902777777777777 | 0 |
| 0.9909722222222223 | 0 |
| 0.9916666666666667 | 0 |
| 0.9923611111111111 | 0 |
| 0.9930555555555555 | 0 |
| 0.99375 | 0 |
| 0.9944444444444445 | 0 |
| 0.9951388888888889 | 0 |
| 0.9958333333333332 | 0 |
| 0.9965277777777778 | 0 |
| 0.9972222222222222 | 0 |
| 0.9979166666666667 | 0 |
| 0.998611111111111 | 0 |
| 0.9993055555555556 | 0 |